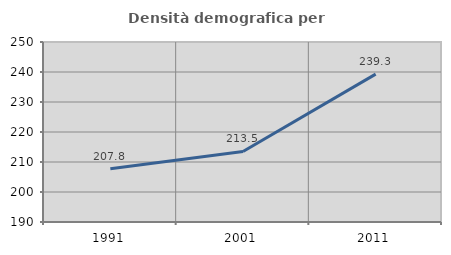
| Category | Densità demografica |
|---|---|
| 1991.0 | 207.764 |
| 2001.0 | 213.507 |
| 2011.0 | 239.286 |